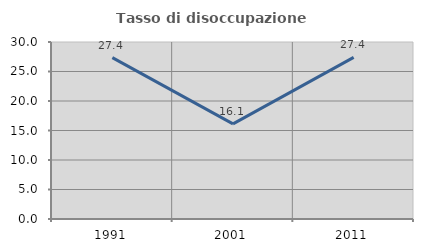
| Category | Tasso di disoccupazione giovanile  |
|---|---|
| 1991.0 | 27.358 |
| 2001.0 | 16.129 |
| 2011.0 | 27.397 |